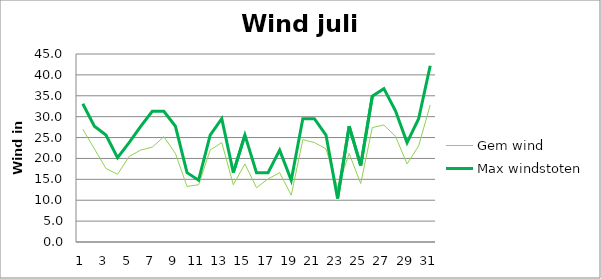
| Category | Gem wind | Max windstoten |
|---|---|---|
| 0 | 27 | 33.1 |
| 1 | 22.3 | 27.7 |
| 2 | 17.6 | 25.6 |
| 3 | 16.2 | 20.2 |
| 4 | 20.5 | 23.8 |
| 5 | 22 | 27.7 |
| 6 | 22.7 | 31.3 |
| 7 | 25.2 | 31.3 |
| 8 | 21.2 | 27.7 |
| 9 | 13.3 | 16.6 |
| 10 | 13.7 | 14.8 |
| 11 | 22 | 25.6 |
| 12 | 23.8 | 29.5 |
| 13 | 13.7 | 16.6 |
| 14 | 18.7 | 25.6 |
| 15 | 13 | 16.6 |
| 16 | 15.1 | 16.6 |
| 17 | 16.6 | 22 |
| 18 | 11.2 | 14.8 |
| 19 | 24.5 | 29.5 |
| 20 | 23.8 | 29.5 |
| 21 | 22.3 | 25.6 |
| 22 | 13 | 10.4 |
| 23 | 21.2 | 27.7 |
| 24 | 14 | 18.3 |
| 25 | 27.4 | 34.9 |
| 26 | 28 | 36.7 |
| 27 | 25.3 | 31.4 |
| 28 | 18.7 | 23.8 |
| 29 | 23 | 29.5 |
| 30 | 32.8 | 42.2 |